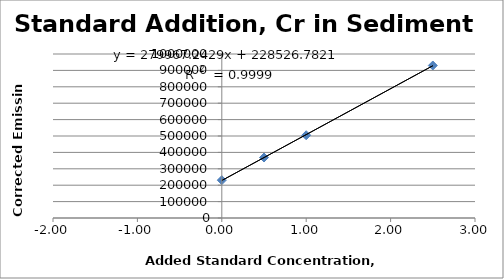
| Category | Series 0 |
|---|---|
| 0.0 | 230643.2 |
| 0.5 | 368760.8 |
| 1.0 | 504632.8 |
| 2.5 | 929939.3 |